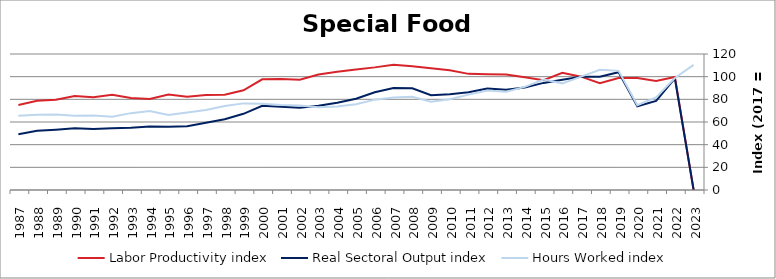
| Category | Labor Productivity index | Real Sectoral Output index | Hours Worked index |
|---|---|---|---|
| 2023.0 | 0 | 0 | 110.382 |
| 2022.0 | 99.749 | 98.595 | 98.844 |
| 2021.0 | 96.291 | 78.612 | 81.64 |
| 2020.0 | 98.828 | 73.899 | 74.775 |
| 2019.0 | 98.875 | 103.949 | 105.132 |
| 2018.0 | 94.222 | 99.906 | 106.033 |
| 2017.0 | 100 | 100 | 100 |
| 2016.0 | 103.422 | 97.328 | 94.108 |
| 2015.0 | 96.952 | 94.508 | 97.48 |
| 2014.0 | 99.432 | 90.46 | 90.976 |
| 2013.0 | 101.954 | 88.38 | 86.687 |
| 2012.0 | 102.085 | 89.526 | 87.697 |
| 2011.0 | 102.469 | 86.216 | 84.139 |
| 2010.0 | 105.69 | 84.566 | 80.013 |
| 2009.0 | 107.449 | 83.604 | 77.808 |
| 2008.0 | 109.097 | 89.83 | 82.34 |
| 2007.0 | 110.501 | 90.087 | 81.526 |
| 2006.0 | 108.195 | 86.266 | 79.732 |
| 2005.0 | 106.398 | 80.592 | 75.745 |
| 2004.0 | 104.403 | 76.991 | 73.744 |
| 2003.0 | 101.851 | 74.376 | 73.024 |
| 2002.0 | 97.284 | 72.501 | 74.526 |
| 2001.0 | 97.839 | 73.388 | 75.009 |
| 2000.0 | 97.664 | 74.236 | 76.011 |
| 1999.0 | 87.934 | 67.205 | 76.427 |
| 1998.0 | 84.099 | 62.383 | 74.178 |
| 1997.0 | 83.916 | 59.249 | 70.604 |
| 1996.0 | 82.329 | 56.355 | 68.452 |
| 1995.0 | 84.233 | 55.778 | 66.218 |
| 1994.0 | 80.39 | 56.058 | 69.732 |
| 1993.0 | 81.122 | 55.021 | 67.825 |
| 1992.0 | 84.12 | 54.377 | 64.643 |
| 1991.0 | 81.738 | 53.755 | 65.765 |
| 1990.0 | 83.033 | 54.421 | 65.542 |
| 1989.0 | 79.694 | 53.166 | 66.712 |
| 1988.0 | 78.787 | 52.23 | 66.292 |
| 1987.0 | 75.087 | 49.218 | 65.547 |